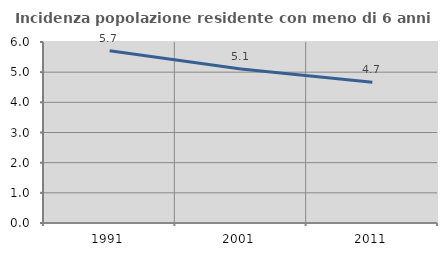
| Category | Incidenza popolazione residente con meno di 6 anni |
|---|---|
| 1991.0 | 5.712 |
| 2001.0 | 5.107 |
| 2011.0 | 4.663 |